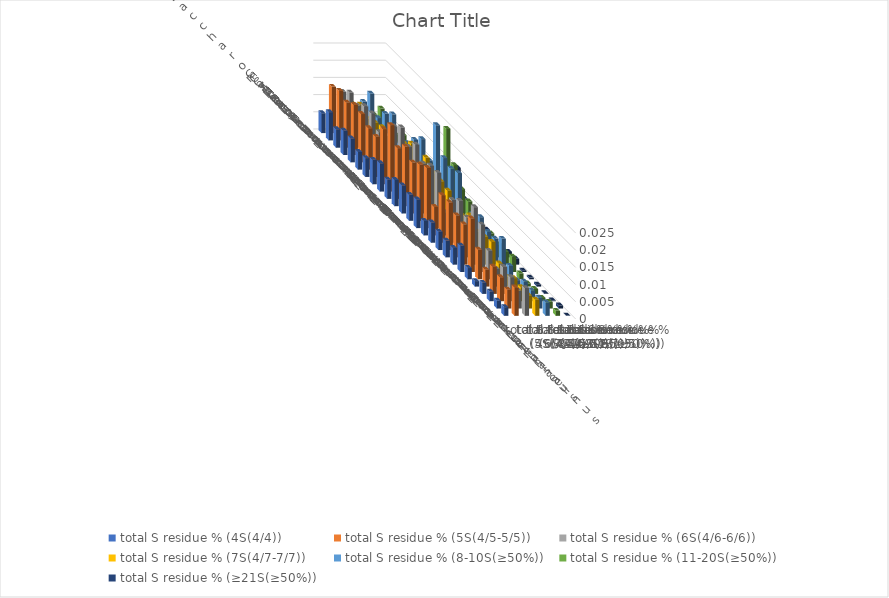
| Category | total S residue % (4S(4/4)) | total S residue % (5S(4/5-5/5)) | total S residue % (6S(4/6-6/6)) | total S residue % (7S(4/7-7/7)) | total S residue % (8-10S(≥50%)) | total S residue % (11-20S(≥50%)) | total S residue % (≥21S(≥50%)) |
|---|---|---|---|---|---|---|---|
| Saccharomyces cerevisiae S288c | 0.006 | 0.013 | 0.012 | 0.008 | 0.009 | 0.005 | 0.002 |
| Candida albicans | 0.008 | 0.014 | 0.014 | 0.01 | 0.014 | 0.009 | 0.001 |
| Candida auris | 0.005 | 0.013 | 0.012 | 0.008 | 0.009 | 0.005 | 0.003 |
| Candida tropicalis | 0.007 | 0.015 | 0.014 | 0.009 | 0.012 | 0.006 | 0.003 |
| Neurospora crassa | 0.007 | 0.014 | 0.014 | 0.01 | 0.014 | 0.008 | 0.002 |
| Magnaporthe oryzae | 0.005 | 0.012 | 0.011 | 0.007 | 0.007 | 0.003 | 0.001 |
| Trichoderma reesei | 0.005 | 0.012 | 0.012 | 0.008 | 0.01 | 0.007 | 0.001 |
| Cryptococcus neoformans | 0.007 | 0.016 | 0.017 | 0.012 | 0.013 | 0.006 | 0.001 |
| Ustilago maydis | 0.008 | 0.019 | 0.019 | 0.014 | 0.015 | 0.008 | 0.001 |
| Taiwanofungus camphoratus | 0.006 | 0.015 | 0.015 | 0.01 | 0.011 | 0.005 | 0.001 |
| Dictyostelium discoideum | 0.008 | 0.017 | 0.018 | 0.014 | 0.024 | 0.022 | 0.011 |
| Chlamydomonas reinhardtii | 0.008 | 0.015 | 0.015 | 0.012 | 0.016 | 0.014 | 0.004 |
| Drosophila melanogaster | 0.008 | 0.016 | 0.016 | 0.011 | 0.015 | 0.009 | 0.002 |
| Aedes aegypti | 0.008 | 0.018 | 0.016 | 0.011 | 0.016 | 0.008 | 0.002 |
| Plasmodium falciparum | 0.004 | 0.008 | 0.007 | 0.004 | 0.004 | 0.003 | 0.002 |
| Caenorhabditis elegans | 0.006 | 0.014 | 0.012 | 0.008 | 0.008 | 0.004 | 0.001 |
| Danio rerio | 0.005 | 0.014 | 0.014 | 0.01 | 0.01 | 0.005 | 0.001 |
| Mus musculus | 0.005 | 0.012 | 0.012 | 0.007 | 0.007 | 0.004 | 0.002 |
| Homo sapiens | 0.005 | 0.012 | 0.017 | 0.008 | 0.008 | 0.004 | 0.002 |
| Arabidopsis thaliana | 0.008 | 0.016 | 0.014 | 0.009 | 0.01 | 0.004 | 0 |
| Tetrahymena thermophila | 0.003 | 0.009 | 0.008 | 0.005 | 0.004 | 0.002 | 0 |
| Paramecium tetraurelia | 0.002 | 0.005 | 0.005 | 0.003 | 0.002 | 0.001 | 0.001 |
| Oxytricha trifallax | 0.003 | 0.008 | 0.008 | 0.005 | 0.004 | 0.001 | 0 |
| Stylonychia lemnae | 0.003 | 0.007 | 0.007 | 0.004 | 0.003 | 0.001 | 0 |
| Pseudocohnilembus persalinus | 0.002 | 0.005 | 0.005 | 0.004 | 0.003 | 0.002 | 0.001 |
| Stentor coeruleus | 0.003 | 0.008 | 0.008 | 0.005 | 0.004 | 0.001 | 0 |